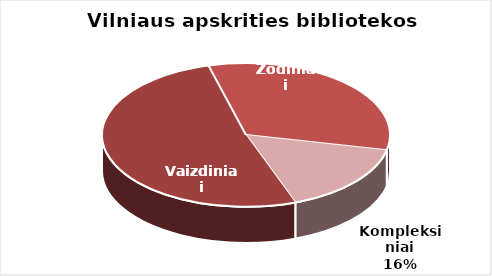
| Category | Series 0 |
|---|---|
| Vaizdiniai | 3187 |
| Žodiniai | 2024 |
| Kompleksiniai | 994 |